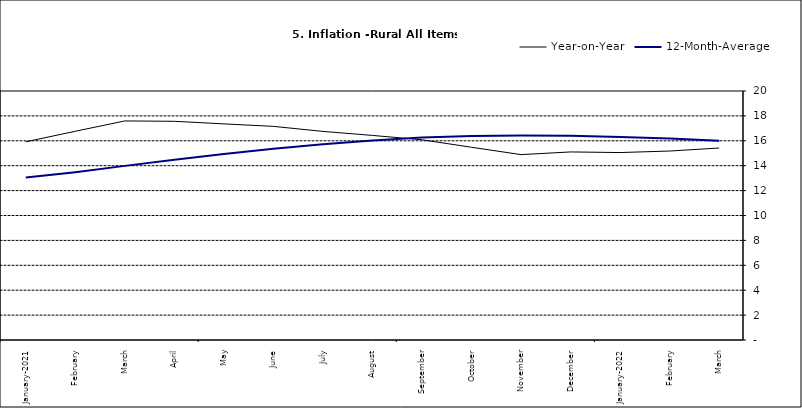
| Category | Year-on-Year | 12-Month-Average |
|---|---|---|
| January-2021 | 15.918 | 13.043 |
| February | 16.766 | 13.482 |
| March | 17.596 | 13.985 |
| April | 17.566 | 14.475 |
| May | 17.358 | 14.935 |
| June | 17.159 | 15.362 |
| July | 16.753 | 15.726 |
| August | 16.433 | 16.03 |
| September | 16.081 | 16.26 |
| October | 15.48 | 16.393 |
| November | 14.89 | 16.419 |
| December | 15.106 | 16.397 |
| January-2022 | 15.055 | 16.313 |
| February | 15.179 | 16.176 |
| March | 15.421 | 15.999 |